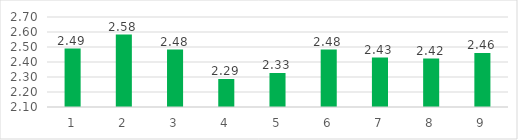
| Category | Series 0 |
|---|---|
| 0 | 2.49 |
| 1 | 2.583 |
| 2 | 2.483 |
| 3 | 2.287 |
| 4 | 2.327 |
| 5 | 2.483 |
| 6 | 2.43 |
| 7 | 2.423 |
| 8 | 2.46 |